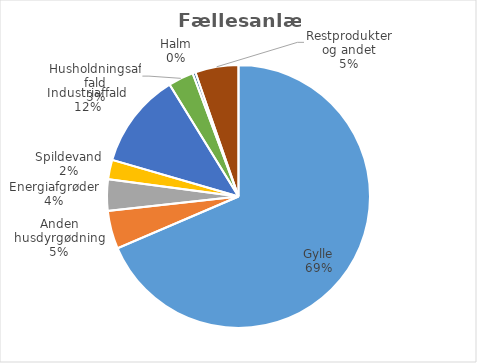
| Category | Series 0 |
|---|---|
| Gylle | 3697851.41 |
| Anden husdyrgødning | 253109.12 |
| Energiafgrøder | 207322.81 |
| Spildevand | 129209 |
| Industriaffald | 632361.48 |
| Husholdningsaffald | 167796.7 |
| Halm | 19459 |
| Restprodukter og andet | 286577.02 |